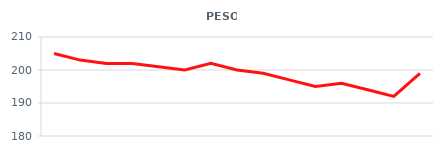
| Category | Series 0 |
|---|---|
| 6/1/12 | 205 |
| 6/2/12 | 203 |
| 6/3/12 | 202 |
| 6/4/12 | 202 |
| 6/5/12 | 201 |
| 6/6/12 | 200 |
| 6/7/12 | 202 |
| 6/8/12 | 200 |
| 6/9/12 | 199 |
| 6/10/12 | 197 |
| 6/11/12 | 195 |
| 6/12/12 | 196 |
| 6/13/12 | 194 |
| 6/14/12 | 192 |
| 6/15/12 | 199 |